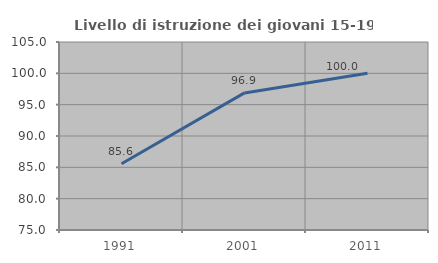
| Category | Livello di istruzione dei giovani 15-19 anni |
|---|---|
| 1991.0 | 85.577 |
| 2001.0 | 96.875 |
| 2011.0 | 100 |